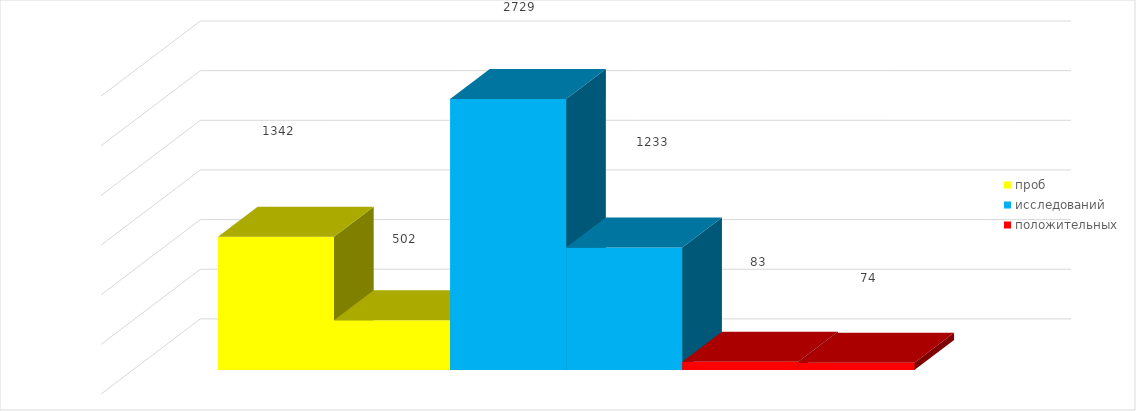
| Category | проб | 1 квартал 2019 год | исследований | положительных |
|---|---|---|---|---|
| 1 квартал 2018 год | 1342 | 502 | 1233 | 74 |